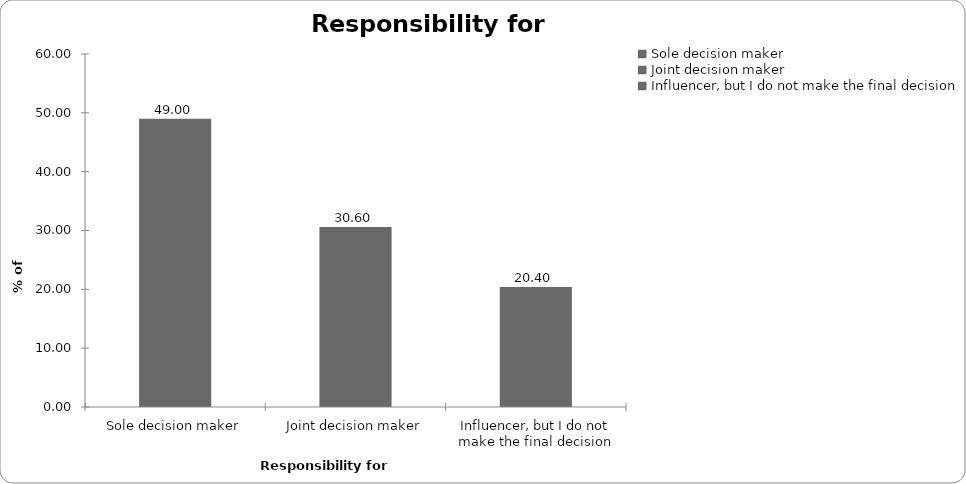
| Category | Responsibility for insurance |
|---|---|
| Sole decision maker | 49 |
| Joint decision maker | 30.6 |
| Influencer, but I do not make the final decision | 20.4 |